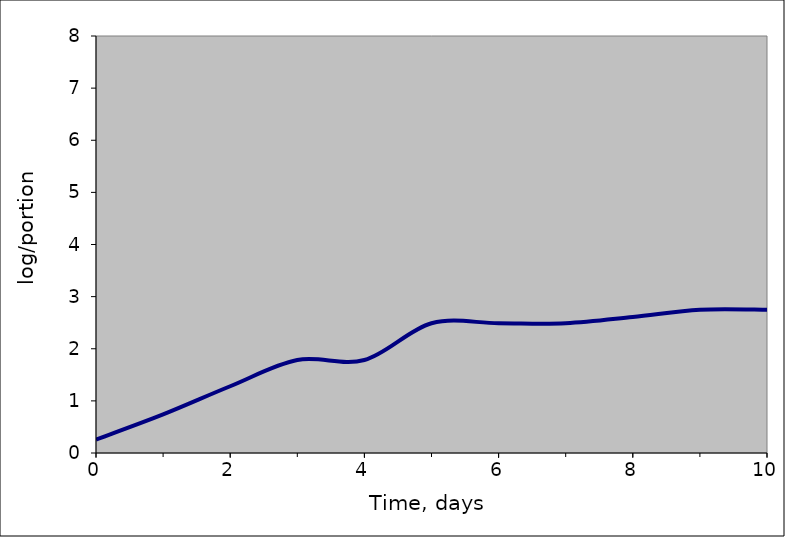
| Category | Series 0 |
|---|---|
| 0.0 | 0.258 |
| 1.0 | 0.741 |
| 2.0 | 1.281 |
| 3.0 | 1.783 |
| 4.0 | 1.784 |
| 5.0 | 2.489 |
| 6.0 | 2.49 |
| 7.0 | 2.49 |
| 8.0 | 2.608 |
| 9.0 | 2.75 |
| 10.0 | 2.75 |